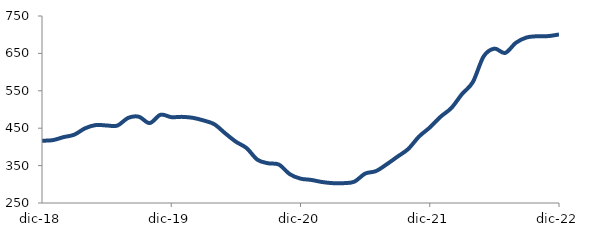
| Category | Series 0 |
|---|---|
| 2018-12-01 | 416.457 |
| 2019-01-01 | 418.023 |
| 2019-02-01 | 426.141 |
| 2019-03-01 | 432.718 |
| 2019-04-01 | 449.714 |
| 2019-05-01 | 458.458 |
| 2019-06-01 | 457.312 |
| 2019-07-01 | 457.058 |
| 2019-08-01 | 477.544 |
| 2019-09-01 | 480.652 |
| 2019-10-01 | 463.67 |
| 2019-11-01 | 485.887 |
| 2019-12-01 | 479.593 |
| 2020-01-01 | 480.293 |
| 2020-02-01 | 477.774 |
| 2020-03-01 | 470.708 |
| 2020-04-01 | 460.537 |
| 2020-05-01 | 436.562 |
| 2020-06-01 | 413.857 |
| 2020-07-01 | 396.652 |
| 2020-08-01 | 365.687 |
| 2020-09-01 | 356.18 |
| 2020-10-01 | 352.658 |
| 2020-11-01 | 327.164 |
| 2020-12-01 | 315.173 |
| 2021-01-01 | 311.708 |
| 2021-02-01 | 306.103 |
| 2021-03-01 | 303.075 |
| 2021-04-01 | 303.034 |
| 2021-05-01 | 306.996 |
| 2021-06-01 | 328.614 |
| 2021-07-01 | 335.232 |
| 2021-08-01 | 353.414 |
| 2021-09-01 | 373.869 |
| 2021-10-01 | 394.393 |
| 2021-11-01 | 427.592 |
| 2021-12-01 | 451.83 |
| 2022-01-01 | 480.528 |
| 2022-02-01 | 503.882 |
| 2022-03-01 | 541.428 |
| 2022-04-01 | 573.261 |
| 2022-05-01 | 641.774 |
| 2022-06-01 | 662.728 |
| 2022-07-01 | 651.267 |
| 2022-08-01 | 678.506 |
| 2022-09-01 | 692.688 |
| 2022-10-01 | 695.873 |
| 2022-11-01 | 696.235 |
| 2022-12-01 | 700.598 |